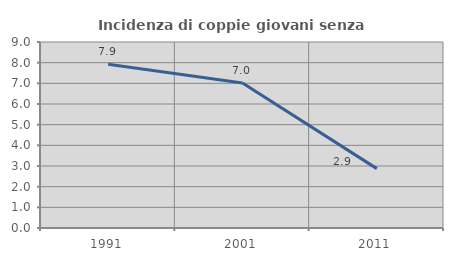
| Category | Incidenza di coppie giovani senza figli |
|---|---|
| 1991.0 | 7.918 |
| 2001.0 | 7.021 |
| 2011.0 | 2.872 |